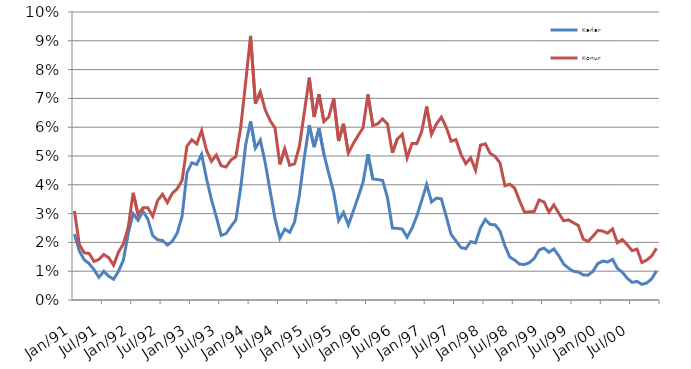
| Category | Karlar | Konur |
|---|---|---|
| 1991-01-01 | 2.288 | 3.095 |
| 1991-02-01 | 1.698 | 1.925 |
| 1991-03-01 | 1.396 | 1.641 |
| 1991-04-01 | 1.265 | 1.614 |
| 1991-05-01 | 1.053 | 1.338 |
| 1991-06-01 | 0.786 | 1.408 |
| 1991-07-01 | 0.995 | 1.581 |
| 1991-08-01 | 0.831 | 1.47 |
| 1991-09-01 | 0.719 | 1.209 |
| 1991-10-01 | 0.996 | 1.662 |
| 1991-11-01 | 1.383 | 1.945 |
| 1991-12-01 | 2.312 | 2.53 |
| 1992-01-01 | 2.995 | 3.722 |
| 1992-02-01 | 2.769 | 2.965 |
| 1992-03-01 | 3.081 | 3.199 |
| 1992-04-01 | 2.812 | 3.203 |
| 1992-05-01 | 2.236 | 2.904 |
| 1992-06-01 | 2.091 | 3.45 |
| 1992-07-01 | 2.066 | 3.672 |
| 1992-08-01 | 1.908 | 3.382 |
| 1992-09-01 | 2.038 | 3.702 |
| 1992-10-01 | 2.32 | 3.86 |
| 1992-11-01 | 2.905 | 4.15 |
| 1992-12-01 | 4.42 | 5.339 |
| 1993-01-01 | 4.765 | 5.565 |
| 1993-02-01 | 4.707 | 5.42 |
| 1993-03-01 | 5.056 | 5.881 |
| 1993-04-01 | 4.216 | 5.195 |
| 1993-05-01 | 3.492 | 4.814 |
| 1993-06-01 | 2.889 | 5.033 |
| 1993-07-01 | 2.242 | 4.66 |
| 1993-08-01 | 2.307 | 4.618 |
| 1993-09-01 | 2.557 | 4.862 |
| 1993-10-01 | 2.78 | 4.976 |
| 1993-11-01 | 3.912 | 6.008 |
| 1993-12-01 | 5.385 | 7.557 |
| 1994-01-01 | 6.203 | 9.17 |
| 1994-02-01 | 5.271 | 6.822 |
| 1994-03-01 | 5.553 | 7.225 |
| 1994-04-01 | 4.764 | 6.605 |
| 1994-05-01 | 3.795 | 6.231 |
| 1994-06-01 | 2.827 | 5.973 |
| 1994-07-01 | 2.149 | 4.709 |
| 1994-08-01 | 2.46 | 5.254 |
| 1994-09-01 | 2.351 | 4.675 |
| 1994-10-01 | 2.708 | 4.726 |
| 1994-11-01 | 3.655 | 5.349 |
| 1994-12-01 | 4.958 | 6.529 |
| 1995-01-01 | 6.066 | 7.72 |
| 1995-02-01 | 5.308 | 6.355 |
| 1995-03-01 | 5.957 | 7.146 |
| 1995-04-01 | 5.066 | 6.192 |
| 1995-05-01 | 4.386 | 6.358 |
| 1995-06-01 | 3.73 | 6.999 |
| 1995-07-01 | 2.751 | 5.52 |
| 1995-08-01 | 3.041 | 6.119 |
| 1995-09-01 | 2.609 | 5.1 |
| 1995-10-01 | 3.083 | 5.433 |
| 1995-11-01 | 3.577 | 5.714 |
| 1995-12-01 | 4.092 | 5.981 |
| 1996-01-01 | 5.064 | 7.14 |
| 1996-02-01 | 4.206 | 6.056 |
| 1996-03-01 | 4.179 | 6.119 |
| 1996-04-01 | 4.153 | 6.286 |
| 1996-05-01 | 3.549 | 6.111 |
| 1996-06-01 | 2.497 | 5.111 |
| 1996-07-01 | 2.486 | 5.589 |
| 1996-08-01 | 2.464 | 5.753 |
| 1996-09-01 | 2.181 | 4.935 |
| 1996-10-01 | 2.485 | 5.437 |
| 1996-11-01 | 2.919 | 5.428 |
| 1996-12-01 | 3.461 | 5.857 |
| 1997-01-01 | 4.009 | 6.716 |
| 1997-02-01 | 3.405 | 5.751 |
| 1997-03-01 | 3.537 | 6.113 |
| 1997-04-01 | 3.513 | 6.351 |
| 1997-05-01 | 2.908 | 5.999 |
| 1997-06-01 | 2.28 | 5.515 |
| 1997-07-01 | 2.05 | 5.571 |
| 1997-08-01 | 1.822 | 5.066 |
| 1997-09-01 | 1.785 | 4.733 |
| 1997-10-01 | 2.026 | 4.935 |
| 1997-11-01 | 1.984 | 4.505 |
| 1997-12-01 | 2.505 | 5.378 |
| 1998-01-01 | 2.797 | 5.421 |
| 1998-02-01 | 2.622 | 5.088 |
| 1998-03-01 | 2.609 | 4.985 |
| 1998-04-01 | 2.393 | 4.761 |
| 1998-05-01 | 1.88 | 3.966 |
| 1998-06-01 | 1.491 | 4.019 |
| 1998-07-01 | 1.386 | 3.885 |
| 1998-08-01 | 1.243 | 3.445 |
| 1998-09-01 | 1.233 | 3.052 |
| 1998-10-01 | 1.296 | 3.061 |
| 1998-11-01 | 1.448 | 3.076 |
| 1998-12-01 | 1.736 | 3.474 |
| 1999-01-01 | 1.803 | 3.405 |
| 1999-02-01 | 1.657 | 3.053 |
| 1999-03-01 | 1.773 | 3.303 |
| 1999-04-01 | 1.54 | 3.017 |
| 1999-05-01 | 1.25 | 2.749 |
| 1999-06-01 | 1.106 | 2.783 |
| 1999-07-01 | 0.996 | 2.682 |
| 1999-08-01 | 0.975 | 2.589 |
| 1999-09-01 | 0.87 | 2.119 |
| 1999-10-01 | 0.862 | 2.035 |
| 1999-11-01 | 0.998 | 2.215 |
| 1999-12-01 | 1.267 | 2.414 |
| 2000-01-01 | 1.353 | 2.393 |
| 2000-02-01 | 1.321 | 2.321 |
| 2000-03-01 | 1.41 | 2.467 |
| 2000-04-01 | 1.096 | 1.986 |
| 2000-05-01 | 0.966 | 2.101 |
| 2000-06-01 | 0.754 | 1.921 |
| 2000-07-01 | 0.612 | 1.714 |
| 2000-08-01 | 0.646 | 1.768 |
| 2000-09-01 | 0.544 | 1.3 |
| 2000-10-01 | 0.592 | 1.385 |
| 2000-11-01 | 0.734 | 1.531 |
| 2000-12-01 | 1.01 | 1.796 |